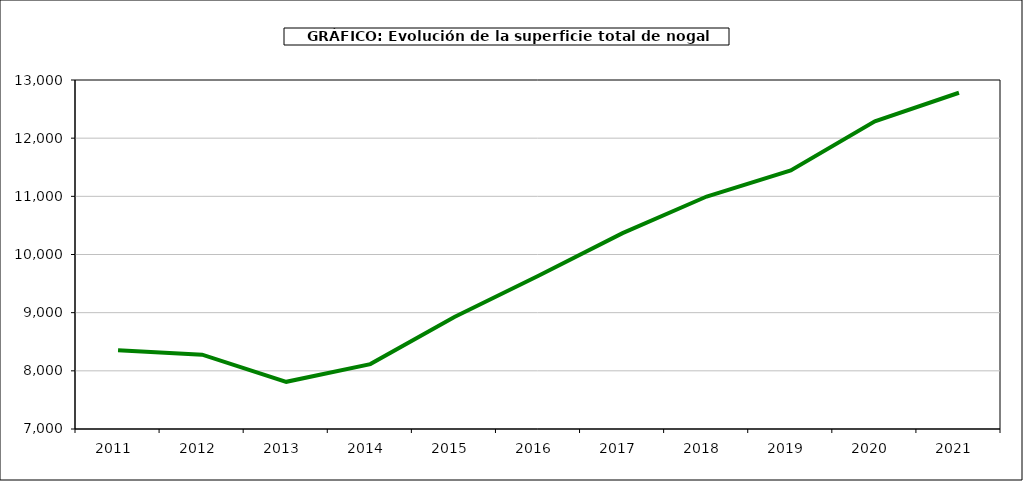
| Category | superficie nogal |
|---|---|
| 2011.0 | 8355 |
| 2012.0 | 8278 |
| 2013.0 | 7811 |
| 2014.0 | 8116 |
| 2015.0 | 8926 |
| 2016.0 | 9634 |
| 2017.0 | 10367 |
| 2018.0 | 10997 |
| 2019.0 | 11444 |
| 2020.0 | 12290 |
| 2021.0 | 12781 |